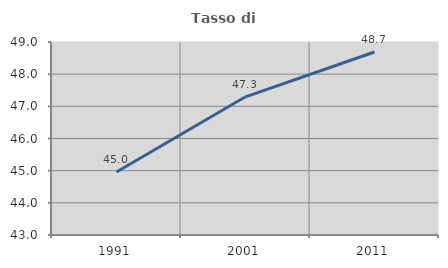
| Category | Tasso di occupazione   |
|---|---|
| 1991.0 | 44.957 |
| 2001.0 | 47.296 |
| 2011.0 | 48.689 |